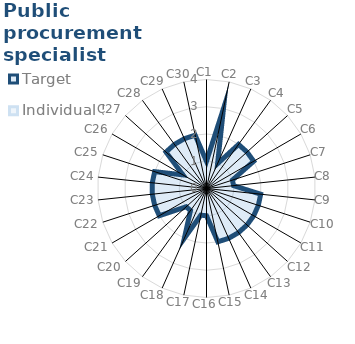
| Category | Target | Individual 5 |
|---|---|---|
| C1 | 1 | 0 |
| C2 | 3 | 0 |
| C3 | 1 | 0 |
| C4 | 2 | 0 |
| C5 | 2 | 0 |
| C6 | 2 | 0 |
| C7 | 1 | 0 |
| C8 | 1 | 0 |
| C9 | 2 | 0 |
| C10 | 2 | 0 |
| C11 | 2 | 0 |
| C12 | 2 | 0 |
| C13 | 2 | 0 |
| C14 | 2 | 0 |
| C15 | 2 | 0 |
| C16 | 1 | 0 |
| C17 | 1 | 0 |
| C18 | 2 | 0 |
| C19 | 1 | 0 |
| C20 | 1 | 0 |
| C21 | 2 | 0 |
| C22 | 2 | 0 |
| C23 | 2 | 0 |
| C24 | 2 | 0 |
| C25 | 2 | 0 |
| C26 | 1 | 0 |
| C27 | 2 | 0 |
| C28 | 2 | 0 |
| C29 | 2 | 0 |
| C30 | 2 | 0 |